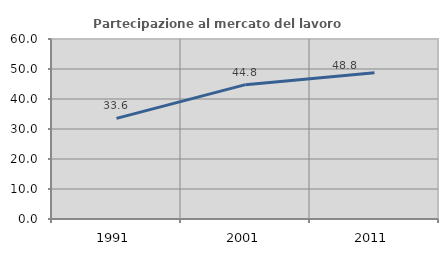
| Category | Partecipazione al mercato del lavoro  femminile |
|---|---|
| 1991.0 | 33.551 |
| 2001.0 | 44.777 |
| 2011.0 | 48.764 |